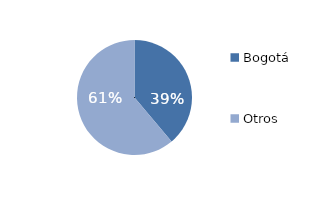
| Category | Series 0 |
|---|---|
| Bogotá | 38.848 |
| Otros | 61.152 |